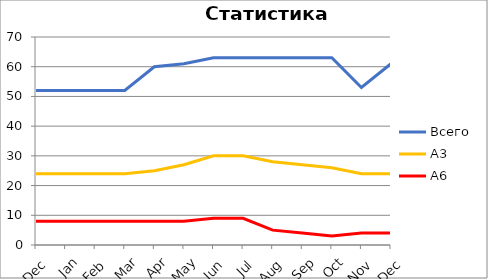
| Category | Всего | А3 | A6 |
|---|---|---|---|
| 0 | 52 | 24 | 8 |
| 1 | 52 | 24 | 8 |
| 2 | 52 | 24 | 8 |
| 3 | 52 | 24 | 8 |
| 4 | 60 | 25 | 8 |
| 5 | 61 | 27 | 8 |
| 6 | 63 | 30 | 9 |
| 7 | 63 | 30 | 9 |
| 8 | 63 | 28 | 5 |
| 9 | 63 | 27 | 4 |
| 10 | 63 | 26 | 3 |
| 11 | 53 | 24 | 4 |
| 12 | 61 | 24 | 4 |